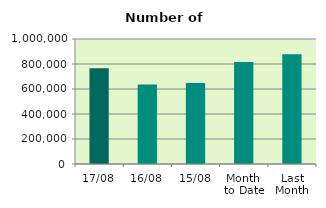
| Category | Series 0 |
|---|---|
| 17/08 | 765210 |
| 16/08 | 635582 |
| 15/08 | 648688 |
| Month 
to Date | 815164.923 |
| Last
Month | 877151.619 |